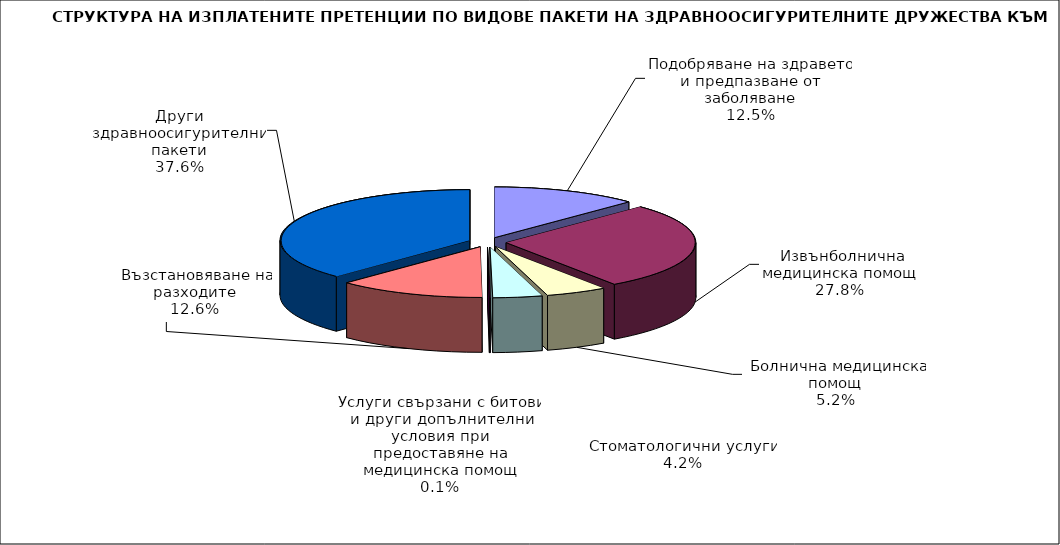
| Category | Series 0 |
|---|---|
| 1. Подобряване на здравето и предпазване от заболяване | 1052351.35 |
| 2. Извънболнична медицинска помощ | 2338852.218 |
| 3. Болнична медицинска помощ | 439992.78 |
| 4. Стоматологични услуги | 353321.484 |
| 5. Услуги свързани с битови и други допълнителни условия при предоставяне на медицинска помощ | 5882.16 |
| 6. Възстановяване на разходите | 1057421.15 |
| 7. Други здравноосигурителни пакети | 3159595.409 |